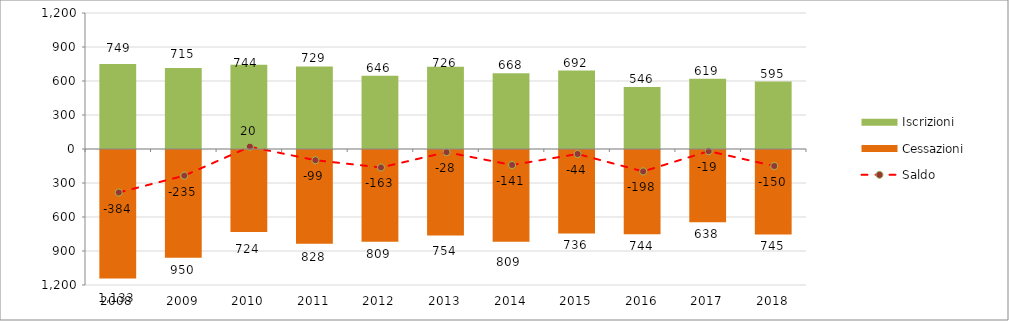
| Category | Iscrizioni | Cessazioni |
|---|---|---|
| 2008.0 | 749 | -1133 |
| 2009.0 | 715 | -950 |
| 2010.0 | 744 | -724 |
| 2011.0 | 729 | -828 |
| 2012.0 | 646 | -809 |
| 2013.0 | 726 | -754 |
| 2014.0 | 668 | -809 |
| 2015.0 | 692 | -736 |
| 2016.0 | 546 | -744 |
| 2017.0 | 619 | -638 |
| 2018.0 | 595 | -745 |